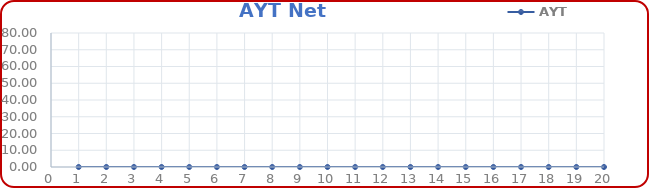
| Category | AYT |
|---|---|
| 0 | 0 |
| 1 | 0 |
| 2 | 0 |
| 3 | 0 |
| 4 | 0 |
| 5 | 0 |
| 6 | 0 |
| 7 | 0 |
| 8 | 0 |
| 9 | 0 |
| 10 | 0 |
| 11 | 0 |
| 12 | 0 |
| 13 | 0 |
| 14 | 0 |
| 15 | 0 |
| 16 | 0 |
| 17 | 0 |
| 18 | 0 |
| 19 | 0 |